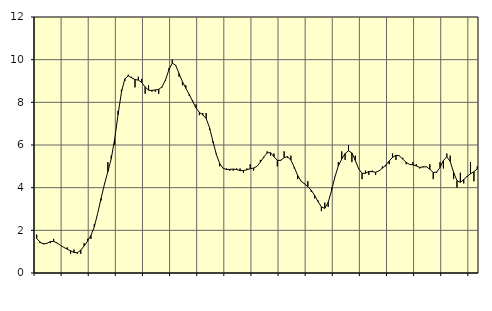
| Category | Piggar | Series 1 |
|---|---|---|
| nan | 1.8 | 1.62 |
| 87.0 | 1.4 | 1.45 |
| 87.0 | 1.4 | 1.36 |
| 87.0 | 1.4 | 1.39 |
| nan | 1.4 | 1.47 |
| 88.0 | 1.6 | 1.48 |
| 88.0 | 1.4 | 1.41 |
| 88.0 | 1.3 | 1.3 |
| nan | 1.2 | 1.2 |
| 89.0 | 1.2 | 1.12 |
| 89.0 | 0.9 | 1.04 |
| 89.0 | 1.1 | 0.96 |
| nan | 0.9 | 0.95 |
| 90.0 | 0.9 | 1.07 |
| 90.0 | 1.4 | 1.27 |
| 90.0 | 1.6 | 1.49 |
| nan | 1.6 | 1.76 |
| 91.0 | 2.3 | 2.17 |
| 91.0 | 2.8 | 2.8 |
| 91.0 | 3.4 | 3.5 |
| nan | 4.2 | 4.17 |
| 92.0 | 5.2 | 4.75 |
| 92.0 | 5.5 | 5.36 |
| 92.0 | 6 | 6.27 |
| nan | 7.6 | 7.42 |
| 93.0 | 8.6 | 8.47 |
| 93.0 | 9 | 9.1 |
| 93.0 | 9.3 | 9.24 |
| nan | 9.2 | 9.15 |
| 94.0 | 8.7 | 9.07 |
| 94.0 | 9.2 | 9.04 |
| 94.0 | 9.1 | 8.93 |
| nan | 8.4 | 8.72 |
| 95.0 | 8.8 | 8.57 |
| 95.0 | 8.5 | 8.56 |
| 95.0 | 8.5 | 8.58 |
| nan | 8.4 | 8.61 |
| 96.0 | 8.7 | 8.73 |
| 96.0 | 9 | 9.05 |
| 96.0 | 9.6 | 9.52 |
| nan | 10 | 9.84 |
| 97.0 | 9.7 | 9.74 |
| 97.0 | 9.2 | 9.35 |
| 97.0 | 8.8 | 8.97 |
| nan | 8.8 | 8.66 |
| 98.0 | 8.3 | 8.37 |
| 98.0 | 8.1 | 8.05 |
| 98.0 | 7.9 | 7.74 |
| nan | 7.4 | 7.53 |
| 99.0 | 7.5 | 7.41 |
| 99.0 | 7.5 | 7.24 |
| 99.0 | 6.7 | 6.81 |
| nan | 6.1 | 6.17 |
| 0.0 | 5.6 | 5.56 |
| 0.0 | 5 | 5.13 |
| 0.0 | 4.9 | 4.91 |
| nan | 4.9 | 4.85 |
| 1.0 | 4.8 | 4.86 |
| 1.0 | 4.8 | 4.87 |
| 1.0 | 4.9 | 4.85 |
| nan | 4.9 | 4.8 |
| 2.0 | 4.7 | 4.8 |
| 2.0 | 4.9 | 4.84 |
| 2.0 | 5.1 | 4.89 |
| nan | 4.8 | 4.92 |
| 3.0 | 5 | 5 |
| 3.0 | 5.3 | 5.2 |
| 3.0 | 5.4 | 5.44 |
| nan | 5.7 | 5.63 |
| 4.0 | 5.5 | 5.64 |
| 4.0 | 5.6 | 5.45 |
| 4.0 | 5 | 5.28 |
| nan | 5.3 | 5.28 |
| 5.0 | 5.7 | 5.41 |
| 5.0 | 5.4 | 5.45 |
| 5.0 | 5.5 | 5.29 |
| nan | 4.9 | 4.96 |
| 6.0 | 4.4 | 4.57 |
| 6.0 | 4.3 | 4.31 |
| 6.0 | 4.2 | 4.18 |
| nan | 4.3 | 4.05 |
| 7.0 | 3.8 | 3.88 |
| 7.0 | 3.5 | 3.64 |
| 7.0 | 3.4 | 3.35 |
| nan | 2.9 | 3.1 |
| 8.0 | 3.3 | 3.03 |
| 8.0 | 3.1 | 3.31 |
| 8.0 | 4 | 3.87 |
| nan | 4.5 | 4.51 |
| 9.0 | 5.2 | 5.02 |
| 9.0 | 5.7 | 5.34 |
| 9.0 | 5.3 | 5.6 |
| nan | 6 | 5.73 |
| 10.0 | 5.2 | 5.63 |
| 10.0 | 5.5 | 5.28 |
| 10.0 | 4.9 | 4.88 |
| nan | 4.4 | 4.67 |
| 11.0 | 4.8 | 4.67 |
| 11.0 | 4.6 | 4.76 |
| 11.0 | 4.8 | 4.75 |
| nan | 4.6 | 4.72 |
| 12.0 | 4.8 | 4.79 |
| 12.0 | 5 | 4.91 |
| 12.0 | 5 | 5.06 |
| nan | 5.1 | 5.25 |
| 13.0 | 5.6 | 5.42 |
| 13.0 | 5.3 | 5.52 |
| 13.0 | 5.5 | 5.49 |
| nan | 5.4 | 5.34 |
| 14.0 | 5.1 | 5.19 |
| 14.0 | 5.1 | 5.09 |
| 14.0 | 5.2 | 5.07 |
| nan | 5.1 | 5.02 |
| 15.0 | 4.9 | 4.95 |
| 15.0 | 5 | 4.97 |
| 15.0 | 5 | 4.98 |
| nan | 5.1 | 4.86 |
| 16.0 | 4.4 | 4.71 |
| 16.0 | 4.7 | 4.73 |
| 16.0 | 5.2 | 4.95 |
| nan | 4.9 | 5.27 |
| 17.0 | 5.6 | 5.45 |
| 17.0 | 5.5 | 5.23 |
| 17.0 | 4.4 | 4.72 |
| nan | 4 | 4.33 |
| 18.0 | 4.7 | 4.25 |
| 18.0 | 4.2 | 4.38 |
| 18.0 | 4.5 | 4.53 |
| nan | 5.2 | 4.65 |
| 19.0 | 4.3 | 4.75 |
| 19.0 | 5 | 4.88 |